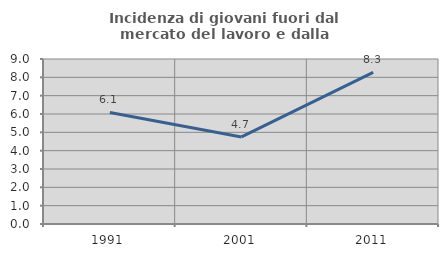
| Category | Incidenza di giovani fuori dal mercato del lavoro e dalla formazione  |
|---|---|
| 1991.0 | 6.085 |
| 2001.0 | 4.748 |
| 2011.0 | 8.268 |